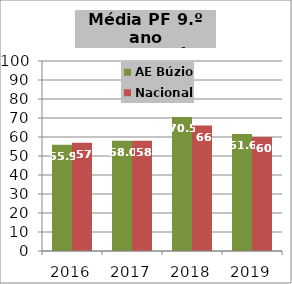
| Category | AE Búzio | Nacional |
|---|---|---|
| 2016.0 | 55.9 | 57 |
| 2017.0 | 58 | 58 |
| 2018.0 | 70.5 | 66 |
| 2019.0 | 61.6 | 60 |